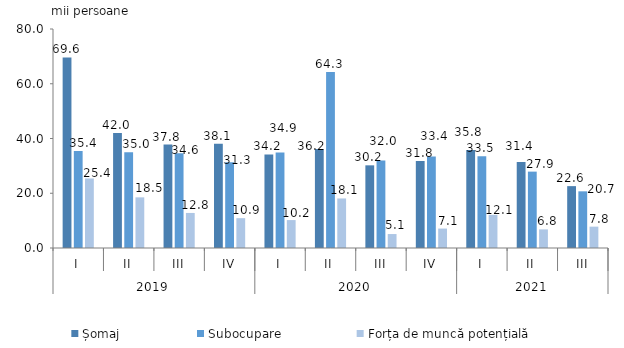
| Category | Șomaj | Subocupare | Forța de muncă potențială |
|---|---|---|---|
| 0 | 69.6 | 35.4 | 25.4 |
| 1 | 42 | 35 | 18.5 |
| 2 | 37.8 | 34.6 | 12.8 |
| 3 | 38.1 | 31.3 | 10.9 |
| 4 | 34.2 | 34.9 | 10.2 |
| 5 | 36.2 | 64.3 | 18.1 |
| 6 | 30.2 | 32 | 5.1 |
| 7 | 31.8 | 33.4 | 7.1 |
| 8 | 35.8 | 33.5 | 12.1 |
| 9 | 31.4 | 27.9 | 6.8 |
| 10 | 22.6 | 20.7 | 7.8 |